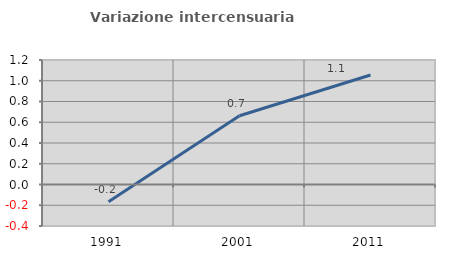
| Category | Variazione intercensuaria annua |
|---|---|
| 1991.0 | -0.165 |
| 2001.0 | 0.662 |
| 2011.0 | 1.055 |